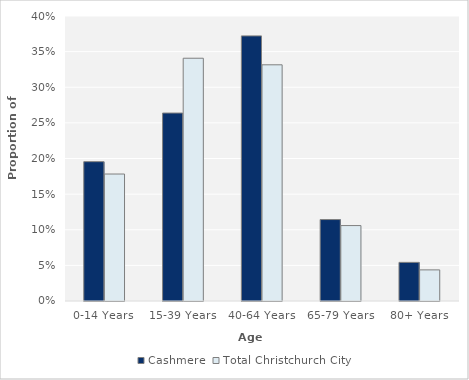
| Category | Cashmere | Total Christchurch City |
|---|---|---|
| 0-14 Years | 0.196 | 0.178 |
| 15-39 Years | 0.264 | 0.341 |
| 40-64 Years | 0.372 | 0.331 |
| 65-79 Years | 0.114 | 0.106 |
| 80+ Years | 0.054 | 0.044 |